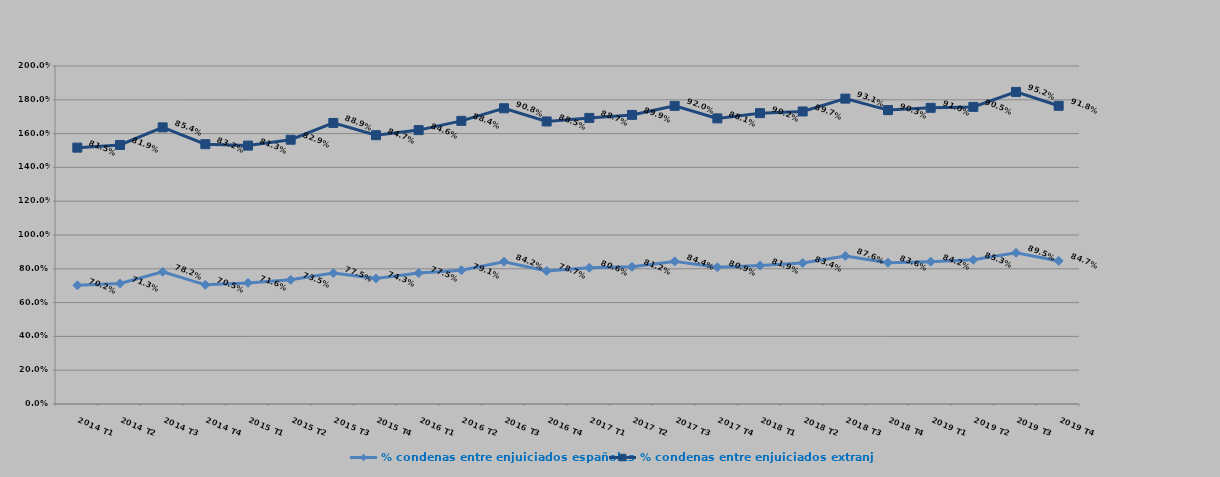
| Category | % condenas entre enjuiciados españoles | % condenas entre enjuiciados extranjeros |
|---|---|---|
| 2014 T1 | 0.702 | 0.815 |
| 2014 T2 | 0.713 | 0.819 |
| 2014 T3 | 0.782 | 0.854 |
| 2014 T4 | 0.705 | 0.832 |
| 2015 T1 | 0.716 | 0.812 |
| 2015 T2 | 0.735 | 0.829 |
| 2015 T3 | 0.775 | 0.889 |
| 2015 T4 | 0.743 | 0.847 |
| 2016 T1 | 0.775 | 0.846 |
| 2016 T2 | 0.791 | 0.884 |
| 2016 T3 | 0.842 | 0.908 |
| 2016 T4 | 0.787 | 0.885 |
| 2017 T1 | 0.806 | 0.887 |
| 2017 T2 | 0.812 | 0.899 |
| 2017 T3 | 0.844 | 0.92 |
| 2017 T4 | 0.809 | 0.881 |
| 2018 T1 | 0.819 | 0.902 |
| 2018 T2 | 0.834 | 0.897 |
| 2018 T3 | 0.876 | 0.931 |
| 2018 T4 | 0.836 | 0.903 |
| 2019 T1 | 0.842 | 0.91 |
| 2019 T2 | 0.853 | 0.905 |
| 2019 T3 | 0.895 | 0.952 |
| 2019 T4 | 0.847 | 0.918 |